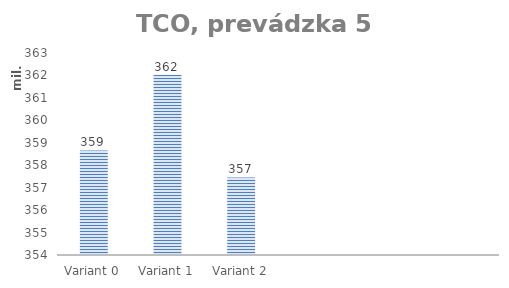
| Category | TCO, prevádzka 5 rokov |
|---|---|
| Variant 0 | 358661242.62 |
| Variant 1 | 362031049.124 |
| Variant 2 | 357455178.022 |